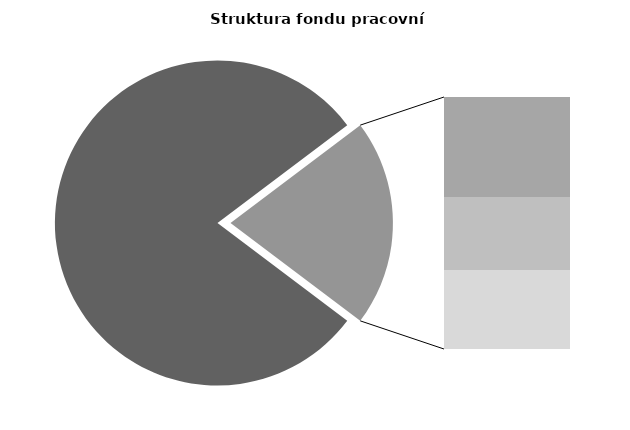
| Category | Series 0 |
|---|---|
| Průměrná měsíční odpracovaná doba bez přesčasu | 135.801 |
| Dovolená | 13.95 |
| Nemoc | 10.192 |
| Jiné | 11.028 |